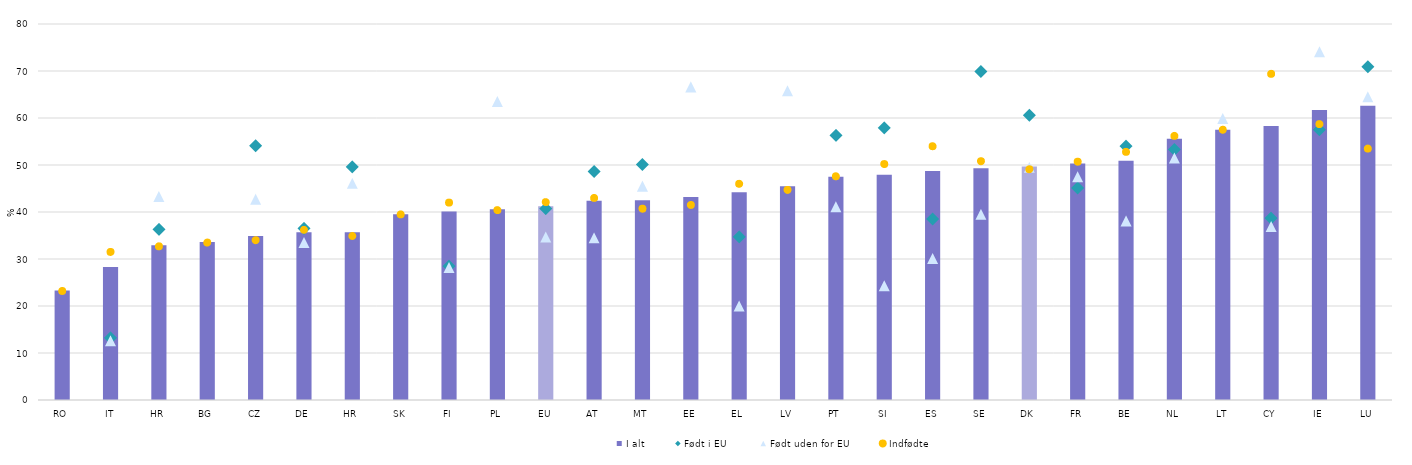
| Category | I alt |
|---|---|
| RO | 23.3 |
| IT | 28.3 |
| HR | 32.9 |
| BG | 33.6 |
| CZ | 34.9 |
| DE | 35.7 |
| HR | 35.7 |
| SK | 39.5 |
| FI | 40.1 |
| PL | 40.6 |
| EU | 41.2 |
| AT | 42.4 |
| MT | 42.5 |
| EE | 43.2 |
| EL | 44.2 |
| LV | 45.5 |
| PT | 47.5 |
| SI | 47.9 |
| ES | 48.7 |
| SE | 49.3 |
| DK | 49.7 |
| FR | 50.3 |
| BE | 50.9 |
| NL | 55.6 |
| LT | 57.5 |
| CY | 58.3 |
| IE | 61.7 |
| LU | 62.6 |